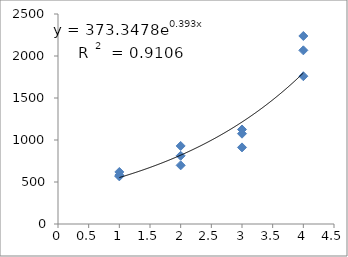
| Category | Series 0 |
|---|---|
| 1.0 | 619.43 |
| 1.0 | 567.408 |
| 1.0 | 581.926 |
| 2.0 | 812.267 |
| 2.0 | 698.37 |
| 2.0 | 929.161 |
| 3.0 | 911.924 |
| 3.0 | 1075.082 |
| 3.0 | 1125.252 |
| 4.0 | 2067.471 |
| 4.0 | 1759.392 |
| 4.0 | 2238.214 |